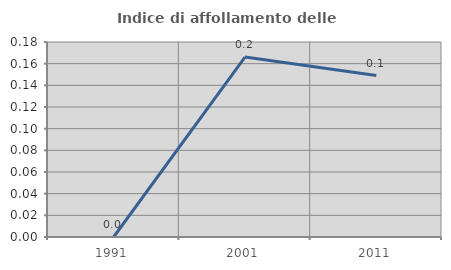
| Category | Indice di affollamento delle abitazioni  |
|---|---|
| 1991.0 | 0 |
| 2001.0 | 0.166 |
| 2011.0 | 0.149 |